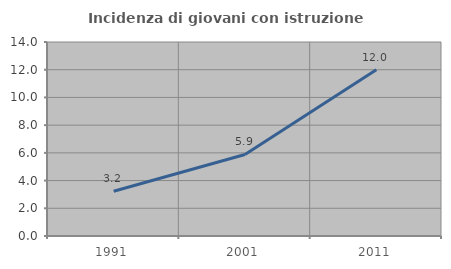
| Category | Incidenza di giovani con istruzione universitaria |
|---|---|
| 1991.0 | 3.226 |
| 2001.0 | 5.882 |
| 2011.0 | 12 |